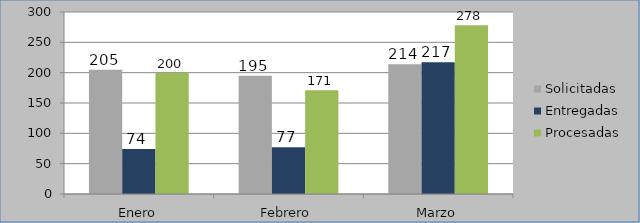
| Category | Solicitadas | Entregadas | Procesadas |
|---|---|---|---|
| Enero | 205 | 74 | 200 |
| Febrero | 195 | 77 | 171 |
| Marzo | 214 | 217 | 278 |